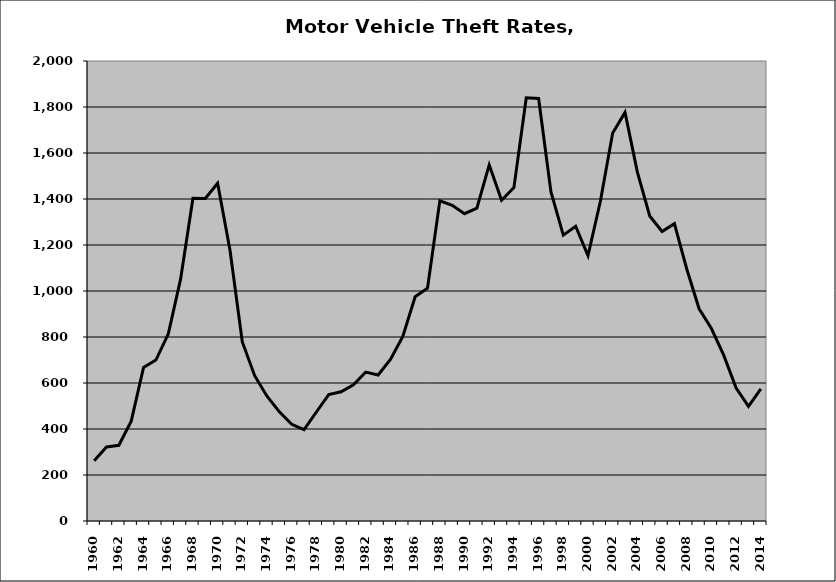
| Category | Motor Vehicle |
|---|---|
| 1960.0 | 262.188 |
| 1961.0 | 321.877 |
| 1962.0 | 329.209 |
| 1963.0 | 434.211 |
| 1964.0 | 667.327 |
| 1965.0 | 699.751 |
| 1966.0 | 812.5 |
| 1967.0 | 1051.545 |
| 1968.0 | 1403.461 |
| 1969.0 | 1402.256 |
| 1970.0 | 1468.586 |
| 1971.0 | 1178.408 |
| 1972.0 | 778.209 |
| 1973.0 | 631.769 |
| 1974.0 | 542.739 |
| 1975.0 | 474.441 |
| 1976.0 | 420.513 |
| 1977.0 | 397.391 |
| 1978.0 | 473.887 |
| 1979.0 | 549.695 |
| 1980.0 | 561.684 |
| 1981.0 | 591.981 |
| 1982.0 | 647.544 |
| 1983.0 | 634.831 |
| 1984.0 | 702.087 |
| 1985.0 | 802.716 |
| 1986.0 | 975.24 |
| 1987.0 | 1012.379 |
| 1988.0 | 1392.419 |
| 1989.0 | 1372.682 |
| 1990.0 | 1336.134 |
| 1991.0 | 1360.368 |
| 1992.0 | 1548.048 |
| 1993.0 | 1394.81 |
| 1994.0 | 1449.298 |
| 1995.0 | 1839.892 |
| 1996.0 | 1837.017 |
| 1997.0 | 1430.813 |
| 1998.0 | 1243.021 |
| 1999.0 | 1281.696 |
| 2000.0 | 1153.727 |
| 2001.0 | 1388.932 |
| 2002.0 | 1686.529 |
| 2003.0 | 1776.479 |
| 2004.0 | 1517.035 |
| 2005.0 | 1326.349 |
| 2006.0 | 1258.92 |
| 2007.0 | 1292.895 |
| 2008.0 | 1095.625 |
| 2009.0 | 922.527 |
| 2010.0 | 836.93 |
| 2011.0 | 720.009 |
| 2012.0 | 578.283 |
| 2013.0 | 498.22 |
| 2014.0 | 574.145 |